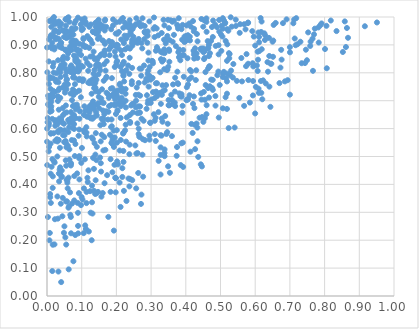
| Category | Series 0 |
|---|---|
| 0.09332710742494632 | 0.635 |
| 0.08445246162562603 | 0.884 |
| 0.07001065503858117 | 0.827 |
| 0.6175253635349519 | 0.728 |
| 0.2744635906738888 | 0.888 |
| 0.061878417320481716 | 0.927 |
| 0.5136913905522834 | 0.98 |
| 0.11229336429314907 | 0.894 |
| 0.21602554632952942 | 0.864 |
| 0.4311145293390619 | 0.87 |
| 0.16754405911338444 | 0.991 |
| 0.3433235673087809 | 0.756 |
| 0.07033823107351322 | 0.897 |
| 0.19841753488332126 | 0.422 |
| 0.3276426470451601 | 0.506 |
| 0.7664976223954308 | 0.807 |
| 0.39625087854839414 | 0.91 |
| 0.04155995003741242 | 0.594 |
| 0.07890753765123992 | 0.977 |
| 0.12596352039203473 | 0.917 |
| 0.4964711650466057 | 0.948 |
| 0.4855994701979328 | 0.682 |
| 0.22039779512864766 | 0.789 |
| 0.35327517767631733 | 0.917 |
| 0.27705013705300396 | 0.428 |
| 0.06475947491705092 | 0.489 |
| 0.4942906293879895 | 0.899 |
| 0.4666430380774208 | 0.9 |
| 0.004846066885495159 | 0.518 |
| 0.10168989879299051 | 0.776 |
| 0.28118632028872204 | 0.947 |
| 0.18745959743924945 | 0.91 |
| 0.11001641885964175 | 0.892 |
| 0.40000335743049165 | 0.914 |
| 0.8053465265295358 | 0.968 |
| 0.08268522239571108 | 0.986 |
| 0.05066881257949596 | 0.758 |
| 0.2958596130232868 | 0.821 |
| 0.264169184591568 | 0.763 |
| 0.16630125288114517 | 0.952 |
| 0.01908088426361776 | 0.973 |
| 0.4593293309129458 | 0.982 |
| 0.05322837337756159 | 0.814 |
| 0.35216622674176457 | 0.878 |
| 0.6071208070080384 | 0.876 |
| 0.2456572896289445 | 0.415 |
| 0.26573200326790547 | 0.657 |
| 0.39141594621713616 | 0.55 |
| 0.08928936337730742 | 0.998 |
| 0.24599749893954848 | 0.897 |
| 0.23038132674363954 | 0.929 |
| 0.5280387680229458 | 0.791 |
| 0.16349903066257399 | 0.616 |
| 0.04958725665321273 | 0.552 |
| 0.0906008137902683 | 0.841 |
| 0.058665780813514146 | 0.948 |
| 0.2667766734859971 | 0.571 |
| 0.21619199094090402 | 0.805 |
| 0.2201868654534751 | 0.792 |
| 0.46898604125320953 | 0.822 |
| 0.6228110973298812 | 0.773 |
| 0.24251388401160068 | 0.958 |
| 0.646489513069468 | 0.832 |
| 0.20215746823162783 | 0.483 |
| 0.25591988275008015 | 0.721 |
| 0.19957029502681156 | 0.713 |
| 0.3812703520432381 | 0.726 |
| 0.21317789538150267 | 0.681 |
| 0.31621910735336844 | 0.728 |
| 0.8643451407871104 | 0.961 |
| 0.14337560606574395 | 0.685 |
| 0.01113406494337299 | 0.782 |
| 0.21985365618289754 | 0.961 |
| 0.6184346737530718 | 0.984 |
| 0.22359208503867978 | 0.933 |
| 0.312879678731237 | 0.639 |
| 0.18844648614245108 | 0.443 |
| 0.3392166535859019 | 0.738 |
| 0.16821976768291746 | 0.524 |
| 0.24463389227182275 | 0.908 |
| 0.7830595978854772 | 0.908 |
| 0.05536913540709898 | 0.467 |
| 0.4023186252905987 | 0.97 |
| 0.32175715372743285 | 0.484 |
| 0.13593288709277007 | 0.745 |
| 0.5098297426781042 | 0.988 |
| 0.09178418392804732 | 0.828 |
| 0.1953236289787702 | 0.821 |
| 0.30271041620228245 | 0.843 |
| 0.07454220480122842 | 0.681 |
| 0.20054662481336893 | 0.723 |
| 0.6109428215271936 | 0.928 |
| 0.15783913526252114 | 0.578 |
| 0.4594565427972541 | 0.995 |
| 0.06253065912574474 | 0.096 |
| 0.36005964984153405 | 0.573 |
| 0.003281615494549195 | 0.718 |
| 0.01097020839997731 | 0.582 |
| 0.19046866440673127 | 0.991 |
| 0.651390417432133 | 0.857 |
| 0.4253634393287855 | 0.614 |
| 0.4222748516593592 | 0.879 |
| 0.07872089254696313 | 0.43 |
| 0.6935785593855301 | 0.773 |
| 0.1585916894620102 | 0.741 |
| 0.38025066018264264 | 0.856 |
| 0.6106923915943925 | 0.728 |
| 0.3486004078403644 | 0.99 |
| 0.8581592307479587 | 0.984 |
| 0.2725581462711324 | 0.635 |
| 0.4207794218268186 | 0.689 |
| 0.14597139255213043 | 0.954 |
| 0.23966946698583524 | 0.62 |
| 0.0566540468076171 | 0.658 |
| 0.11638407443537113 | 0.424 |
| 0.33796336739709554 | 0.884 |
| 0.40075615961090194 | 0.932 |
| 0.09139228247904929 | 0.774 |
| 0.005998731451986483 | 0.92 |
| 0.2605015388213099 | 0.618 |
| 0.08717087606148055 | 0.836 |
| 0.18842786301452996 | 0.745 |
| 0.018727076246454977 | 0.835 |
| 0.4776199384597343 | 0.775 |
| 0.16442855009449853 | 0.867 |
| 0.1233873500221011 | 0.77 |
| 0.27218812383937463 | 0.907 |
| 0.19625404301459715 | 0.897 |
| 0.298887643289107 | 0.692 |
| 0.24529104173198069 | 0.818 |
| 0.7435082480763096 | 0.835 |
| 0.2070733014234135 | 0.946 |
| 0.13880443767661266 | 0.978 |
| 0.13293540101599677 | 0.698 |
| 0.07402278244869576 | 0.602 |
| 0.8526028761861107 | 0.875 |
| 0.4142389530679762 | 0.966 |
| 0.13685206612459078 | 0.81 |
| 0.08168515643849006 | 0.842 |
| 0.22516878922713846 | 0.593 |
| 0.040858666964380896 | 0.05 |
| 0.4237770416445613 | 0.958 |
| 0.6263433940962674 | 0.941 |
| 0.6163695303992871 | 0.771 |
| 0.08328091790722525 | 0.678 |
| 0.07429241103262896 | 0.619 |
| 0.2929290122923942 | 0.75 |
| 0.32842864378299375 | 0.849 |
| 0.3468407766614354 | 0.811 |
| 0.24583307692582623 | 0.688 |
| 0.2549711585187677 | 0.915 |
| 0.2491362299563452 | 0.929 |
| 0.15199192651175242 | 0.822 |
| 0.06757050388877639 | 0.821 |
| 0.05867051996637451 | 0.406 |
| 0.016741287649905012 | 0.429 |
| 0.0595891594296325 | 0.386 |
| 0.17881244385727146 | 0.68 |
| 0.07473345050846947 | 0.8 |
| 0.5565695375040615 | 0.974 |
| 0.22640089580502487 | 0.725 |
| 0.18473958888255082 | 0.896 |
| 0.3253594485430067 | 0.728 |
| 0.223386873137695 | 0.804 |
| 0.6408460916314357 | 0.75 |
| 0.3469642374666171 | 0.932 |
| 0.43204057757435277 | 0.939 |
| 0.1661523724823416 | 0.88 |
| 0.14905683001691739 | 0.731 |
| 0.005708498747101554 | 0.619 |
| 0.2564439577390568 | 0.676 |
| 0.08027008772111877 | 0.502 |
| 0.15370820202005875 | 0.612 |
| 0.10786133806920872 | 0.68 |
| 0.8343741909260847 | 0.95 |
| 0.010706641149494933 | 0.929 |
| 0.15785557753152613 | 0.694 |
| 0.34217571351007203 | 0.915 |
| 0.3736821800458787 | 0.502 |
| 0.19191194376988785 | 0.593 |
| 0.2413830644314252 | 0.939 |
| 0.15684702480620027 | 0.356 |
| 0.034038102988602104 | 0.624 |
| 0.14901498868893603 | 0.83 |
| 0.6049122909608293 | 0.826 |
| 0.07455216035506895 | 0.74 |
| 0.06748433175463864 | 0.726 |
| 0.021485956361151692 | 0.185 |
| 0.033056157756863214 | 0.587 |
| 0.0204756372250543 | 0.947 |
| 0.20181166482287494 | 0.55 |
| 0.01640408438656893 | 0.387 |
| 0.04084063218853917 | 0.976 |
| 0.3042419487356556 | 0.782 |
| 0.5802495257485826 | 0.774 |
| 0.35041093210573937 | 0.703 |
| 0.0071857451910184444 | 0.785 |
| 0.3686024769470495 | 0.733 |
| 0.4600086188989244 | 0.947 |
| 0.09010469843676883 | 0.822 |
| 0.03252993259102299 | 0.627 |
| 0.008685841869015332 | 0.66 |
| 0.05516663706453839 | 0.339 |
| 0.2204348199870224 | 0.585 |
| 0.2151539344671225 | 0.71 |
| 0.015272525534928527 | 0.635 |
| 0.13521579251085947 | 0.641 |
| 0.27957973412668 | 0.826 |
| 0.3389631065390514 | 0.87 |
| 0.0303671699634529 | 0.554 |
| 0.0601939761115966 | 0.539 |
| 0.080157718434822 | 0.782 |
| 0.5407668959036714 | 0.604 |
| 0.39260040006501873 | 0.882 |
| 0.17325945002766663 | 0.433 |
| 0.44405748498341235 | 0.726 |
| 0.38484266647942733 | 0.716 |
| 0.17877283288876789 | 0.884 |
| 0.10496824063477295 | 0.924 |
| 0.3102690774477035 | 0.71 |
| 0.0645887933968502 | 0.621 |
| 0.33579453681614935 | 0.846 |
| 0.22662538269006738 | 0.7 |
| 0.06714236044585487 | 0.291 |
| 0.5370390514409771 | 0.831 |
| 0.08412383113221322 | 0.853 |
| 0.5185994377121194 | 0.67 |
| 0.1059221362961964 | 0.225 |
| 0.4502607122449295 | 0.965 |
| 0.46670432510944615 | 0.86 |
| 0.06937170365005974 | 0.225 |
| 0.02210918003961837 | 0.891 |
| 0.01958036646278216 | 0.484 |
| 0.20212642794837576 | 0.842 |
| 0.06522065853411463 | 0.88 |
| 0.9508638520165739 | 0.98 |
| 0.14376144089441423 | 0.852 |
| 0.015913669154299703 | 0.993 |
| 0.5471191457439915 | 0.771 |
| 0.4447688870937738 | 0.882 |
| 0.2570824320430596 | 0.386 |
| 0.32614903458643074 | 0.802 |
| 0.03207946437220843 | 0.56 |
| 0.13733505801615176 | 0.849 |
| 0.14507108774325783 | 0.98 |
| 0.05125651411912846 | 0.742 |
| 0.06451908244811588 | 0.525 |
| 0.8063100787336912 | 0.816 |
| 0.13944898329144106 | 0.507 |
| 0.10638855669343172 | 0.594 |
| 0.24681600490542566 | 0.957 |
| 0.29231033325554157 | 0.872 |
| 0.40605239575343877 | 0.935 |
| 0.06662478312360698 | 0.932 |
| 0.02209176997923712 | 0.478 |
| 0.029993898051308476 | 0.357 |
| 0.33046985764820536 | 0.943 |
| 0.1831833292838505 | 0.373 |
| 0.4897915927236649 | 0.964 |
| 0.1026257526749228 | 0.77 |
| 0.24440424686058648 | 0.76 |
| 0.2914771635031145 | 0.808 |
| 0.2586239964306333 | 0.747 |
| 0.15339955222973234 | 0.809 |
| 0.41072050829761275 | 0.72 |
| 0.375730141732597 | 0.804 |
| 0.286053557459495 | 0.779 |
| 0.3996406478571656 | 0.918 |
| 0.12419061967398559 | 0.376 |
| 0.034848394874342103 | 0.411 |
| 0.2282354608853071 | 0.966 |
| 0.08260756440638772 | 0.959 |
| 0.2545404442229069 | 0.54 |
| 0.0464511781741489 | 0.952 |
| 0.04111366882620704 | 0.826 |
| 0.19285724943928217 | 0.534 |
| 0.051225878829543436 | 0.655 |
| 0.19800438810327947 | 0.941 |
| 0.10843313025501211 | 0.995 |
| 0.15302408777650434 | 0.496 |
| 0.23822367676987555 | 0.989 |
| 0.01655895290951226 | 0.184 |
| 0.2557938662863637 | 0.974 |
| 0.00908444176340606 | 0.354 |
| 0.09977094511131324 | 0.355 |
| 0.3942071356941327 | 0.786 |
| 0.02122539533457546 | 0.986 |
| 0.14370728586029902 | 0.647 |
| 0.13220178212665434 | 0.948 |
| 0.23244948049871028 | 0.891 |
| 0.019139129109571718 | 0.801 |
| 0.5680885386967607 | 0.974 |
| 0.12992617035090026 | 0.678 |
| 0.09894442398774705 | 0.825 |
| 0.01820347453498028 | 0.78 |
| 0.6188418753118041 | 0.884 |
| 0.024703411323214186 | 0.63 |
| 0.36597066813757295 | 0.987 |
| 0.6405757428511759 | 0.86 |
| 0.6171141159988063 | 0.946 |
| 0.1344769958272003 | 0.876 |
| 0.21487330044220676 | 0.745 |
| 0.4526100434418463 | 0.849 |
| 0.2814711260001591 | 0.968 |
| 0.14694455472670487 | 0.945 |
| 0.03283081190493653 | 0.766 |
| 0.5790578845040826 | 0.978 |
| 0.012759501209366642 | 0.895 |
| 0.6500039046627353 | 0.912 |
| 0.05159515418394256 | 0.729 |
| 0.15053854131981526 | 0.673 |
| 0.3479326615367675 | 0.617 |
| 0.267905927099664 | 0.657 |
| 0.43577658387864504 | 0.498 |
| 0.42394284414178374 | 0.877 |
| 0.5795340222899762 | 0.98 |
| 0.8178368419635587 | 0.987 |
| 0.12874246693615143 | 0.2 |
| 0.21201855289776195 | 0.319 |
| 0.28914740431649444 | 0.908 |
| 0.005081079901098184 | 0.61 |
| 0.40185611518271047 | 0.702 |
| 0.1554028520334675 | 0.968 |
| 0.18881669086162423 | 0.568 |
| 0.4003346729249193 | 0.922 |
| 0.19529991616308195 | 0.734 |
| 0.4432980849404792 | 0.472 |
| 0.07224972377674188 | 0.331 |
| 0.22042749499804415 | 0.48 |
| 0.7491882543967722 | 0.845 |
| 0.5443813914313284 | 0.968 |
| 0.14517408187782888 | 0.832 |
| 0.11392422904308819 | 0.373 |
| 0.6353868749911382 | 0.838 |
| 0.40554845447960697 | 0.704 |
| 0.17166584631758752 | 0.729 |
| 0.16884786065102408 | 0.808 |
| 0.013265056492702598 | 0.463 |
| 0.044275626423304404 | 0.286 |
| 0.10647365320955893 | 0.386 |
| 0.09884495538878879 | 0.477 |
| 0.07084924279744975 | 0.634 |
| 0.13526777115485966 | 0.456 |
| 0.03428342965822673 | 0.921 |
| 0.10928776582457922 | 0.587 |
| 0.05400804894681388 | 0.486 |
| 0.17109967234300394 | 0.965 |
| 0.23906176386118727 | 0.887 |
| 0.45100150572274955 | 0.874 |
| 0.2134497070621566 | 0.88 |
| 0.31346322192172127 | 0.556 |
| 0.16173524046359022 | 0.967 |
| 0.23823230772229664 | 0.542 |
| 0.13055089083321314 | 0.906 |
| 0.6368010547889358 | 0.804 |
| 0.045136171473953435 | 0.85 |
| 0.49462712898370764 | 0.866 |
| 0.0753838215751389 | 0.797 |
| 0.21715410217986542 | 0.458 |
| 0.21929493929766442 | 0.582 |
| 0.3876781147068705 | 0.956 |
| 0.6280504482905608 | 0.918 |
| 0.08714131700045358 | 0.883 |
| 0.6071911472535048 | 0.807 |
| 0.14067641800198227 | 0.584 |
| 0.3275057871336694 | 0.576 |
| 0.149262795889065 | 0.714 |
| 0.16550141423526177 | 0.863 |
| 0.045822207332507414 | 0.951 |
| 0.29158779768503706 | 0.7 |
| 0.23957730519071752 | 0.419 |
| 0.11740715437017546 | 0.643 |
| 0.29006221865924275 | 0.796 |
| 0.1721647613138042 | 0.842 |
| 0.20921505821291198 | 0.407 |
| 0.5097657808779557 | 0.803 |
| 0.6018458667347588 | 0.749 |
| 0.1449252543888515 | 0.848 |
| 0.037909687856379604 | 0.461 |
| 0.3750612652841656 | 0.972 |
| 0.011457533454408808 | 0.935 |
| 0.3942211809178866 | 0.863 |
| 0.26392531463863045 | 0.721 |
| 0.4649939088216555 | 0.889 |
| 0.5263336709797022 | 0.867 |
| 0.0017388114422324241 | 0.623 |
| 0.2721731295461255 | 0.363 |
| 0.21212160163331417 | 0.821 |
| 0.332683979185301 | 0.755 |
| 0.0356612653027748 | 0.744 |
| 0.40634409999288545 | 0.707 |
| 0.11936430844456924 | 0.45 |
| 0.10083859630262593 | 0.991 |
| 0.3005241751384484 | 0.704 |
| 0.10498044779319138 | 0.776 |
| 0.02678150267977808 | 0.925 |
| 0.3693426745666788 | 0.782 |
| 0.33578157276947906 | 0.99 |
| 0.15330219290113467 | 0.958 |
| 0.19587367317365956 | 0.683 |
| 0.014602071854006526 | 0.723 |
| 0.23741473012516934 | 0.393 |
| 0.05552419606507131 | 0.925 |
| 0.250258443605627 | 0.909 |
| 0.018032527978964263 | 0.735 |
| 0.17863281712795476 | 0.914 |
| 0.35308722549145355 | 0.684 |
| 0.31869918762867433 | 0.885 |
| 0.04640427389998536 | 0.576 |
| 0.14841306910884666 | 0.795 |
| 0.2503328063462743 | 0.967 |
| 0.05377282669283878 | 0.991 |
| 0.10049701842690884 | 0.962 |
| 0.3105126659698221 | 0.628 |
| 0.08191212785978508 | 0.545 |
| 0.529392597184269 | 0.999 |
| 0.15066845651588212 | 0.929 |
| 0.12315425340785469 | 0.763 |
| 0.4266507801032685 | 0.888 |
| 0.4160480270557385 | 0.617 |
| 0.07777544541502068 | 0.558 |
| 0.368153269749644 | 0.693 |
| 0.2279793930752365 | 0.553 |
| 0.08512533374722231 | 0.882 |
| 0.4909157907120407 | 0.791 |
| 0.11415695942242132 | 0.643 |
| 0.2858882725830224 | 0.947 |
| 0.05223076412489125 | 0.882 |
| 0.03813965401129793 | 0.71 |
| 0.21086532907816047 | 0.701 |
| 0.17571495296144346 | 0.632 |
| 0.6855558755804928 | 0.769 |
| 0.37772644051302395 | 0.958 |
| 0.23895948007820456 | 0.649 |
| 0.3909568256322439 | 0.972 |
| 0.12573144839185835 | 0.299 |
| 0.10346677462936327 | 0.822 |
| 0.4050635956855102 | 0.852 |
| 0.1967040279093828 | 0.424 |
| 0.026163016534713757 | 0.768 |
| 0.04885639231988381 | 0.617 |
| 0.0690815403738495 | 0.948 |
| 0.4546980263138608 | 0.854 |
| 0.0909789595050775 | 0.574 |
| 0.02281219337127982 | 0.275 |
| 0.16245260833896624 | 0.522 |
| 0.4158517561790839 | 0.783 |
| 0.20027721319084657 | 0.837 |
| 0.035316203125515755 | 0.9 |
| 0.05543576395369576 | 0.547 |
| 0.0010576126301251598 | 0.802 |
| 0.047570400631467114 | 0.858 |
| 0.006872851774574529 | 0.778 |
| 0.165139992445275 | 0.652 |
| 0.5846288556027115 | 0.693 |
| 0.08948385520441304 | 0.251 |
| 0.2568031175442783 | 0.7 |
| 0.05596177997711471 | 0.533 |
| 0.13119636094905007 | 0.635 |
| 0.04916156078890355 | 0.928 |
| 0.012357681979431101 | 0.68 |
| 0.5304843490038923 | 0.808 |
| 0.4232955882723064 | 0.865 |
| 0.3582227986376607 | 0.721 |
| 0.05365384213646518 | 0.951 |
| 0.43971082774412407 | 0.639 |
| 0.2899664962417682 | 0.933 |
| 0.24069647465100208 | 0.947 |
| 0.13627355603223357 | 0.669 |
| 0.16320684056161194 | 0.692 |
| 0.02550317891397824 | 0.976 |
| 0.2170274658994501 | 0.427 |
| 0.21577210011753445 | 0.733 |
| 0.33887090166919864 | 0.501 |
| 0.037784836282205636 | 0.597 |
| 0.09760122461958642 | 0.712 |
| 0.1944878145909379 | 0.47 |
| 0.11452375349579624 | 0.572 |
| 0.07402527514722557 | 0.917 |
| 0.09044608545921784 | 0.811 |
| 0.1522988002005693 | 0.86 |
| 0.4088128823010506 | 0.776 |
| 0.1354466977451717 | 0.682 |
| 0.11154063474820997 | 0.851 |
| 0.023686239966609568 | 0.61 |
| 0.19750302471138248 | 0.858 |
| 0.32723256880415974 | 0.876 |
| 0.518730928278715 | 0.725 |
| 0.03725994636993102 | 0.438 |
| 0.21752463520014265 | 0.83 |
| 0.03808871123692992 | 0.818 |
| 0.08297196715984234 | 0.915 |
| 0.25742569283964667 | 0.51 |
| 0.03359854663744244 | 0.948 |
| 0.012426270863230338 | 0.965 |
| 0.002620480737549058 | 0.283 |
| 0.09503189328068085 | 0.662 |
| 0.4029513531133868 | 0.748 |
| 0.4937934149127994 | 0.804 |
| 0.22163219877716034 | 0.377 |
| 0.38118821075536957 | 0.884 |
| 0.07135231928502594 | 0.559 |
| 0.35139584080179653 | 0.884 |
| 0.08684255004260466 | 0.439 |
| 0.017140030205711088 | 0.822 |
| 0.18399043155415562 | 0.743 |
| 0.06380489989959959 | 0.322 |
| 0.013083677854927589 | 0.663 |
| 0.14292264540834354 | 0.982 |
| 0.09280189478997958 | 0.597 |
| 0.19024004044985432 | 0.97 |
| 0.16344293809144794 | 0.771 |
| 0.06421591713113517 | 0.983 |
| 0.23003797215237753 | 0.64 |
| 0.23371427676611845 | 0.826 |
| 0.05289595413374171 | 0.21 |
| 0.08235555256686755 | 0.638 |
| 0.7121480640214822 | 0.991 |
| 0.2038302832964557 | 0.899 |
| 0.1669001464504679 | 0.987 |
| 0.7002113637719625 | 0.873 |
| 0.20336007925850164 | 0.666 |
| 0.12488159631287665 | 0.858 |
| 0.5601127460885287 | 0.853 |
| 0.3386204107283707 | 0.512 |
| 0.10350389085980105 | 0.957 |
| 0.15661525276790855 | 0.708 |
| 0.015204292338279135 | 0.089 |
| 0.7653105471331986 | 0.922 |
| 0.3923749983564334 | 0.463 |
| 0.008956841283550121 | 0.365 |
| 0.04089126541848842 | 0.908 |
| 0.11377038513802218 | 0.586 |
| 0.6520381472732322 | 0.916 |
| 0.03734042217390454 | 0.531 |
| 0.5945207410657075 | 0.823 |
| 0.2824937651907615 | 0.558 |
| 0.593414098165515 | 0.719 |
| 0.11883936415518725 | 0.666 |
| 0.3172276012376103 | 0.716 |
| 0.015567957025387158 | 0.49 |
| 0.20474338996725328 | 0.737 |
| 0.0846959940701778 | 0.908 |
| 0.12223545165600902 | 0.658 |
| 0.7596731119772844 | 0.912 |
| 0.5542039468226748 | 0.71 |
| 0.09731052409339525 | 0.973 |
| 0.6115411809243902 | 0.878 |
| 0.18558718788989015 | 0.549 |
| 0.8674634189980486 | 0.925 |
| 0.01255501597867792 | 0.708 |
| 0.22786877356171054 | 0.922 |
| 0.0002486938166764707 | 0.891 |
| 0.018741990207220116 | 0.583 |
| 0.15625742928109854 | 0.866 |
| 0.19549473457358435 | 0.876 |
| 0.012497471730546161 | 0.696 |
| 0.45250880161428575 | 0.989 |
| 0.6438292795428854 | 0.678 |
| 0.38371309348260263 | 0.861 |
| 0.7340085040175094 | 0.834 |
| 0.014008212015966026 | 0.888 |
| 0.010288080964908963 | 0.742 |
| 0.05463099130902305 | 0.943 |
| 0.061860615204340275 | 0.317 |
| 0.24746754484318978 | 0.658 |
| 0.27539523276941547 | 0.971 |
| 0.0004996344169901912 | 0.6 |
| 0.061811411312290176 | 0.873 |
| 0.44643125568705144 | 0.464 |
| 0.010650889443437617 | 0.438 |
| 0.44252344656635867 | 0.886 |
| 0.07515223853869424 | 0.783 |
| 0.04367732003278946 | 0.826 |
| 0.20098260635222243 | 0.901 |
| 0.5358155317522965 | 0.783 |
| 0.19803218737591255 | 0.372 |
| 0.12975108758065979 | 0.396 |
| 0.16208063022587516 | 0.914 |
| 0.18997243608362646 | 0.543 |
| 0.005488952961306026 | 0.76 |
| 0.02906766618584511 | 0.615 |
| 0.20947731290156646 | 0.693 |
| 0.26439351153519375 | 0.921 |
| 0.13907867697231024 | 0.748 |
| 0.05452478026891028 | 0.969 |
| 0.4120860367421524 | 0.916 |
| 0.2216261201758395 | 0.907 |
| 0.699960653566993 | 0.722 |
| 0.3136800288962013 | 0.762 |
| 0.057672711633036666 | 0.339 |
| 0.046143304915287064 | 0.747 |
| 0.3327159555829057 | 0.625 |
| 0.20933174461761894 | 0.757 |
| 0.3108632843872676 | 0.58 |
| 0.18705285637486113 | 0.781 |
| 0.05086174237216945 | 0.594 |
| 0.32819057376684857 | 0.689 |
| 0.2684972432122863 | 0.718 |
| 0.4333484408460546 | 0.604 |
| 0.07887641786058175 | 0.898 |
| 0.43371447820001174 | 0.555 |
| 0.44528538533915696 | 0.704 |
| 0.33103729004682936 | 0.721 |
| 0.024403929565210536 | 0.625 |
| 0.07201298492267194 | 0.702 |
| 0.05362020468275619 | 0.555 |
| 0.8012004580152037 | 0.885 |
| 0.18483606788494333 | 0.606 |
| 0.006962183487536855 | 0.2 |
| 0.5066842510609805 | 0.996 |
| 0.7525970636800398 | 0.945 |
| 0.3055233077252437 | 0.731 |
| 0.5680923119813054 | 0.681 |
| 0.24952859948176742 | 0.689 |
| 0.2372019785369519 | 0.796 |
| 0.04177491497255792 | 0.427 |
| 0.05536044265934714 | 0.184 |
| 0.27533171406508705 | 0.995 |
| 0.25748020510217917 | 0.995 |
| 0.41977740546492204 | 0.584 |
| 0.6748871234804585 | 0.882 |
| 0.008081766057076889 | 0.226 |
| 0.20433565630409023 | 0.472 |
| 0.45660728351457125 | 0.803 |
| 0.13282111001037933 | 0.946 |
| 0.46420630187742795 | 0.745 |
| 0.19163294116825091 | 0.564 |
| 0.0033501786690449675 | 0.688 |
| 0.09186323718483713 | 0.369 |
| 0.15473934655532318 | 0.554 |
| 0.4572200343613122 | 0.756 |
| 0.14084682477521704 | 0.94 |
| 0.07765873436403559 | 0.649 |
| 0.09121451064035957 | 0.868 |
| 0.053150940219434006 | 0.79 |
| 0.5187450286836113 | 0.843 |
| 0.4600467534901821 | 0.684 |
| 0.40651249692865754 | 0.758 |
| 0.5938412500481016 | 0.771 |
| 0.523540830462565 | 0.602 |
| 0.14286724918250016 | 0.822 |
| 0.7303778947219662 | 0.911 |
| 0.5252110361006866 | 0.852 |
| 0.14169525007969075 | 0.658 |
| 0.09298847144395861 | 0.501 |
| 0.0901750240406225 | 0.804 |
| 0.210133103768114 | 0.761 |
| 0.03718533041300631 | 0.966 |
| 0.0860898565305993 | 0.686 |
| 0.26426558162133484 | 0.6 |
| 0.0701383873902437 | 0.91 |
| 0.07598993442076452 | 0.816 |
| 0.042774649310710955 | 0.889 |
| 0.5195735409714478 | 0.902 |
| 0.34063186469765205 | 0.645 |
| 0.19413430211357352 | 0.687 |
| 0.16584162889315768 | 0.404 |
| 0.2029944590063707 | 0.662 |
| 0.11044204610510899 | 0.664 |
| 0.056656516336890284 | 0.804 |
| 0.30529436065474946 | 0.834 |
| 0.18671522043180133 | 0.608 |
| 0.040089414342513896 | 0.625 |
| 0.039784600923693625 | 0.331 |
| 0.31008642502725325 | 0.928 |
| 0.24610127593200815 | 0.903 |
| 0.14177790008278146 | 0.965 |
| 0.47258855234531927 | 0.914 |
| 0.49593578692358486 | 0.989 |
| 0.010550378562793505 | 0.986 |
| 0.4288703791130908 | 0.774 |
| 0.03044700340309836 | 0.59 |
| 0.0927360722843874 | 0.493 |
| 0.030857812860972333 | 0.715 |
| 0.3779483357859119 | 0.76 |
| 0.1805031088887219 | 0.863 |
| 0.03421300624281265 | 0.984 |
| 0.025848040526107896 | 0.92 |
| 0.9160231593435163 | 0.967 |
| 0.2975135120847676 | 0.621 |
| 0.03403903393210539 | 0.668 |
| 0.09799341157916142 | 0.326 |
| 0.00742604885392828 | 0.986 |
| 0.5066791771637564 | 0.785 |
| 0.06129048398018533 | 0.588 |
| 0.2139489631219036 | 0.919 |
| 0.045659585932323665 | 0.62 |
| 0.039390920157224785 | 0.814 |
| 0.05825395422726232 | 0.996 |
| 0.15503997563906546 | 0.476 |
| 0.5162780241497349 | 0.78 |
| 0.13401303198173198 | 0.797 |
| 0.06220804741878683 | 0.424 |
| 0.4978162958141088 | 0.756 |
| 0.07824657321439621 | 0.635 |
| 0.040187896180269744 | 0.905 |
| 0.03604322578571029 | 0.637 |
| 0.10522856166674388 | 0.92 |
| 0.020062799779203888 | 1 |
| 0.19588537505318793 | 0.713 |
| 0.14002219962006868 | 0.743 |
| 0.5959127058526833 | 0.93 |
| 0.4630832059218024 | 0.914 |
| 0.74610132173737 | 0.883 |
| 0.056116978232255144 | 0.773 |
| 0.271468148529615 | 0.79 |
| 0.05875093510845786 | 0.852 |
| 0.1668917402002783 | 0.904 |
| 0.5439404055958573 | 0.99 |
| 0.015082744286307181 | 0.908 |
| 0.4335604082262945 | 0.853 |
| 0.028286412365832625 | 0.562 |
| 0.17140608420689385 | 0.786 |
| 0.2187620220719242 | 0.832 |
| 0.08106166496340583 | 0.805 |
| 0.47788825411575053 | 0.928 |
| 0.265571798868785 | 0.981 |
| 0.5998632314874315 | 0.654 |
| 0.34208839876208663 | 0.906 |
| 0.2880298887719308 | 0.72 |
| 0.11742208874851645 | 0.409 |
| 0.06759872639701803 | 0.803 |
| 0.2901127466374849 | 0.948 |
| 0.7182221220252807 | 0.996 |
| 0.4626150317252452 | 0.887 |
| 0.12614118114424644 | 0.973 |
| 0.3463479347366638 | 0.587 |
| 0.3333348658580698 | 0.734 |
| 0.5024034240403104 | 0.879 |
| 0.04185740379545777 | 0.827 |
| 0.5066724004675855 | 0.673 |
| 0.29631386209797717 | 0.788 |
| 0.22534877607126158 | 0.884 |
| 0.19824290725262617 | 0.422 |
| 0.23827763613056385 | 0.854 |
| 0.2357547166980981 | 0.961 |
| 0.3373944826962674 | 0.919 |
| 0.3899610450762362 | 0.657 |
| 0.27633302786027125 | 0.562 |
| 0.35655977536241756 | 0.988 |
| 0.4233682546850699 | 0.715 |
| 0.056241764648346515 | 0.418 |
| 0.17674709476562867 | 0.284 |
| 0.7222267624205686 | 0.903 |
| 0.018466084751469602 | 0.931 |
| 0.5925861499155723 | 0.834 |
| 0.33006586949108807 | 0.575 |
| 0.04878451732892852 | 0.227 |
| 0.38556805368169744 | 0.469 |
| 0.363197449961012 | 0.758 |
| 0.49503691420720564 | 0.64 |
| 0.12969345338245686 | 0.336 |
| 0.07128873536164892 | 0.959 |
| 0.04070397947861926 | 0.634 |
| 0.3842230364588991 | 0.845 |
| 0.18479667285596146 | 0.684 |
| 0.5915967620728743 | 0.949 |
| 0.16258576194396102 | 0.637 |
| 0.131146225754443 | 0.296 |
| 0.5072353484670106 | 0.797 |
| 0.5323421200057737 | 0.965 |
| 0.447042972917825 | 0.642 |
| 0.5056013840860444 | 0.93 |
| 0.06842418918616777 | 0.473 |
| 0.017923927804721962 | 0.715 |
| 0.18661203950176242 | 0.902 |
| 0.008561758041605194 | 0.926 |
| 0.16473501152576742 | 0.831 |
| 0.14107264433497868 | 0.733 |
| 0.26074839863450516 | 0.907 |
| 0.11573750011966955 | 0.836 |
| 0.41151241552313567 | 0.93 |
| 0.23951630091520515 | 0.624 |
| 0.6204403479522804 | 0.705 |
| 0.28078475633378386 | 0.921 |
| 0.13165832277747613 | 0.691 |
| 0.28703104349117337 | 0.671 |
| 0.1558192178829041 | 0.446 |
| 0.07073553519568132 | 0.882 |
| 0.12177203334286779 | 0.922 |
| 0.1259654679452088 | 0.684 |
| 0.22868944865905938 | 0.81 |
| 0.6000221797138257 | 0.897 |
| 0.005982940283025706 | 0.534 |
| 0.268260148412244 | 0.679 |
| 0.004981459529068366 | 0.709 |
| 0.07811186109440327 | 0.684 |
| 0.4843434206482502 | 0.972 |
| 0.13547712804495848 | 0.377 |
| 0.24237769381235352 | 0.683 |
| 0.41339647201674634 | 0.517 |
| 0.07649354827278443 | 0.721 |
| 0.1572944889975061 | 0.635 |
| 0.29757888977719926 | 0.62 |
| 0.08793675848289517 | 0.334 |
| 0.13113621334336256 | 0.777 |
| 0.01092346277229217 | 0.673 |
| 0.4852987362811818 | 0.717 |
| 0.06055831154003799 | 0.869 |
| 0.04541654187371513 | 0.845 |
| 0.48623135062437395 | 0.896 |
| 0.2612570175464287 | 0.512 |
| 0.5735927589291145 | 0.824 |
| 0.06023931751101341 | 0.759 |
| 0.14220233120429282 | 0.487 |
| 0.29577716372556606 | 0.56 |
| 0.10492400589998296 | 0.896 |
| 0.14295217860444043 | 0.368 |
| 0.6285102437123503 | 0.935 |
| 0.47876413378179417 | 0.987 |
| 0.14247714504554465 | 0.775 |
| 0.1617536423792767 | 0.629 |
| 0.3490066928565023 | 0.465 |
| 0.13699207497558508 | 0.548 |
| 0.78746265823905 | 0.97 |
| 0.2290150452345101 | 0.341 |
| 0.20219151306034722 | 0.715 |
| 0.43389792490723866 | 0.913 |
| 0.29030754657830804 | 0.69 |
| 0.70990850340288 | 0.977 |
| 0.7718388625119323 | 0.958 |
| 0.6156086147989185 | 0.996 |
| 0.37962142890132233 | 0.996 |
| 0.5146764789820759 | 0.713 |
| 0.09222012736663576 | 0.736 |
| 0.13209669322895534 | 0.563 |
| 0.4122921900576402 | 0.81 |
| 0.0211637541772004 | 0.884 |
| 0.17648804428150588 | 0.722 |
| 0.1340877051343501 | 0.681 |
| 0.19967661603697784 | 0.981 |
| 0.38769696940605003 | 0.723 |
| 0.0427431340598059 | 0.428 |
| 0.611332162636472 | 0.909 |
| 0.22005420951253418 | 0.52 |
| 0.09418463064504501 | 0.881 |
| 0.06912272072540171 | 0.476 |
| 0.13357358030948696 | 0.947 |
| 0.01048042340170352 | 0.546 |
| 0.06897292613274675 | 0.659 |
| 0.3761959019149912 | 0.763 |
| 0.365868105344743 | 0.936 |
| 0.09264377285364211 | 0.81 |
| 0.06526448549245578 | 0.892 |
| 0.2028063247516687 | 0.94 |
| 0.4641518163424666 | 0.815 |
| 0.07594971088610558 | 0.937 |
| 0.23487204710685095 | 0.421 |
| 0.10914232643205912 | 0.49 |
| 0.08848249623363147 | 0.675 |
| 0.7820533684699434 | 0.963 |
| 0.21976836672809041 | 0.692 |
| 0.1648339639867883 | 0.873 |
| 0.3881156955883802 | 0.714 |
| 0.6304059319389534 | 0.762 |
| 0.5196703291476715 | 0.957 |
| 0.0840565195902091 | 0.73 |
| 0.11130426200255816 | 0.982 |
| 0.19165219291612312 | 0.717 |
| 0.1136941974050828 | 0.333 |
| 0.10067112124137001 | 0.531 |
| 0.2875508356186566 | 0.94 |
| 0.09308402969220353 | 0.904 |
| 0.12863379457024215 | 0.725 |
| 0.11876797279915707 | 0.807 |
| 0.11009404384924348 | 0.253 |
| 0.37159649073665457 | 0.895 |
| 0.04557737588242272 | 0.674 |
| 0.6999169275157038 | 0.892 |
| 0.3963448480350813 | 0.93 |
| 0.0779892348087804 | 0.599 |
| 0.07849552521309977 | 0.343 |
| 0.05312170366697411 | 0.883 |
| 0.00029352328618437173 | 0.553 |
| 0.07905941288951746 | 0.734 |
| 0.519550409324154 | 0.797 |
| 0.08919424653513586 | 0.298 |
| 0.5225436426914166 | 0.951 |
| 0.15975138783418297 | 0.916 |
| 0.11881875387818208 | 0.765 |
| 0.1482454053417782 | 0.691 |
| 0.30726294733442894 | 0.958 |
| 0.10815786685436812 | 0.587 |
| 0.11643162720928646 | 0.931 |
| 0.36398306111141565 | 0.688 |
| 0.09338347861803065 | 0.418 |
| 0.6396430079411699 | 0.925 |
| 0.28243397403999426 | 0.943 |
| 0.2633320868300325 | 0.68 |
| 0.10634057561949983 | 0.982 |
| 0.042482362001901364 | 0.45 |
| 0.14885617961962394 | 0.99 |
| 0.24462451585240363 | 0.77 |
| 0.186036329549354 | 0.633 |
| 0.08989586160493113 | 0.224 |
| 0.05859803189602242 | 0.414 |
| 0.3319586944066403 | 0.84 |
| 0.34541921389069097 | 0.81 |
| 0.29011588554056533 | 0.774 |
| 0.0576172455771804 | 0.777 |
| 0.30841422970488586 | 0.998 |
| 0.07795045344337581 | 0.616 |
| 0.034876627885937594 | 0.812 |
| 0.22476392295174785 | 0.979 |
| 0.08268399141570171 | 0.806 |
| 0.08052252769227841 | 0.759 |
| 0.6081266879535607 | 0.847 |
| 0.42403420144254156 | 0.851 |
| 0.12156158053213217 | 0.889 |
| 0.5187206601584562 | 0.769 |
| 0.22654265105405202 | 0.742 |
| 0.29505731751276165 | 0.984 |
| 0.3440863597604603 | 0.581 |
| 0.14358904587867294 | 0.535 |
| 0.30790171808784106 | 0.651 |
| 0.5243414439879522 | 0.87 |
| 0.032998537370257375 | 0.945 |
| 0.11294862165754183 | 0.975 |
| 0.13889655063170658 | 0.366 |
| 0.03646003326935621 | 0.453 |
| 0.42313023954550044 | 0.949 |
| 0.056621000277171096 | 0.759 |
| 0.3604382021652247 | 0.702 |
| 0.3505042771583595 | 0.684 |
| 0.11332044808938513 | 0.605 |
| 0.039839912187716875 | 0.894 |
| 0.27188091472911835 | 0.815 |
| 0.2267937871124649 | 0.614 |
| 0.050583393405147725 | 0.576 |
| 0.1397749184684033 | 0.788 |
| 0.1915048421365071 | 0.722 |
| 0.031543858079283504 | 0.699 |
| 0.33216697467793455 | 0.872 |
| 0.2663749199828582 | 0.571 |
| 0.22127327609014402 | 0.839 |
| 0.20274103343340932 | 0.689 |
| 0.6699642478180072 | 0.763 |
| 0.3161024911709023 | 0.959 |
| 0.39074538680929716 | 0.682 |
| 0.03859917704979465 | 0.801 |
| 0.07604261538816137 | 0.954 |
| 0.7585913339705429 | 0.896 |
| 0.46923590006324845 | 0.752 |
| 0.38710682168030563 | 0.547 |
| 0.3894461955206605 | 0.919 |
| 0.6097038739732709 | 0.743 |
| 0.054412240450179894 | 0.683 |
| 0.37470126526314307 | 0.534 |
| 0.716541475880962 | 0.899 |
| 0.26754610074749285 | 0.97 |
| 0.2091603106739104 | 0.983 |
| 0.010495737215108103 | 0.584 |
| 0.1768659809083607 | 0.66 |
| 0.04181902603632193 | 0.826 |
| 0.03141404149078031 | 0.277 |
| 0.5796636568258768 | 0.832 |
| 0.18333056392938696 | 0.891 |
| 0.47785859440164846 | 0.739 |
| 0.20945875583226548 | 0.522 |
| 0.19866054008175504 | 0.652 |
| 0.2671422935255451 | 0.815 |
| 0.08148742963202049 | 0.849 |
| 0.2986091809238035 | 0.775 |
| 0.12922432023675856 | 0.568 |
| 0.18488145247061383 | 0.956 |
| 0.672773970681529 | 0.819 |
| 0.170116008352185 | 0.662 |
| 0.4759703665985988 | 0.745 |
| 0.14140425738810924 | 0.827 |
| 0.02120832149420282 | 0.982 |
| 0.16055488832701925 | 0.369 |
| 0.22732989419661553 | 0.676 |
| 0.07782032231278968 | 0.862 |
| 0.2629111591674621 | 0.441 |
| 0.14145281943835175 | 0.965 |
| 0.21469016415915332 | 0.992 |
| 0.445020360132553 | 0.993 |
| 0.05615427968507469 | 0.742 |
| 0.2784922819348814 | 0.628 |
| 0.031252985254932586 | 0.715 |
| 0.33834665023093935 | 0.97 |
| 0.12199842932588134 | 0.964 |
| 0.16120525154885545 | 0.665 |
| 0.026263537746968546 | 0.775 |
| 0.06363776494116635 | 0.604 |
| 0.3614114781023089 | 0.983 |
| 0.10654698169521715 | 0.649 |
| 0.3046055927062298 | 0.841 |
| 0.37714630446430863 | 0.967 |
| 0.19521780995663973 | 0.568 |
| 0.3142030752303294 | 0.733 |
| 0.6904143507527548 | 0.992 |
| 0.4312245948340798 | 0.618 |
| 0.32741786585036614 | 0.533 |
| 0.021036309047690938 | 0.928 |
| 0.7695275005051075 | 0.938 |
| 0.2044926532559722 | 0.889 |
| 0.3272818650985957 | 0.435 |
| 0.07610144954342213 | 0.125 |
| 0.20125452907996777 | 0.594 |
| 0.09829716803391197 | 0.864 |
| 0.6439577669796592 | 0.833 |
| 0.3419381972375547 | 0.919 |
| 0.3204107579879497 | 0.934 |
| 0.13269619545255507 | 0.495 |
| 0.011056772750736354 | 0.334 |
| 0.2922119380376711 | 0.844 |
| 0.029741697725769956 | 0.5 |
| 0.27507872453836935 | 0.506 |
| 0.10222668030920201 | 0.346 |
| 0.4539258169353172 | 0.878 |
| 0.33878219672908216 | 0.525 |
| 0.027658842386204197 | 0.62 |
| 0.1884211426648672 | 0.721 |
| 0.0687291508504303 | 0.283 |
| 0.34929297203588994 | 0.821 |
| 0.3784472738105331 | 0.874 |
| 0.13930836554991854 | 0.764 |
| 0.42492016845821323 | 0.674 |
| 0.6590686594511417 | 0.979 |
| 0.45494755490085426 | 0.637 |
| 0.466921496658221 | 0.711 |
| 0.06871464184420106 | 0.468 |
| 0.23117734764365228 | 0.933 |
| 0.0007496150353275555 | 0.469 |
| 0.12585671163910794 | 0.637 |
| 0.11216472036963498 | 0.24 |
| 0.4510013553952249 | 0.887 |
| 0.18840369817286828 | 0.557 |
| 0.31068065988936366 | 0.964 |
| 0.42683784209273856 | 0.526 |
| 0.10398531321549198 | 0.901 |
| 0.7139317058360984 | 0.923 |
| 0.3171830406629472 | 0.763 |
| 0.06990049652614183 | 0.638 |
| 0.281412779905172 | 0.765 |
| 0.07827080019479049 | 0.898 |
| 0.02256702906479846 | 0.731 |
| 0.18324164262762954 | 0.49 |
| 0.0051197356811730765 | 0.841 |
| 0.14706259690219325 | 0.373 |
| 0.31366215965240174 | 0.879 |
| 0.24539018958775183 | 0.918 |
| 0.08135435876212871 | 0.218 |
| 0.3621756923907469 | 0.911 |
| 0.038882277838726886 | 0.785 |
| 0.08306550589083717 | 0.669 |
| 0.4675063622316057 | 0.824 |
| 0.03191412994162812 | 0.845 |
| 0.1927380032053796 | 0.234 |
| 0.06568843806283409 | 0.805 |
| 0.032869564417961517 | 0.088 |
| 0.23842427899693974 | 0.975 |
| 0.5014620083327535 | 0.937 |
| 0.4456013958112689 | 0.887 |
| 0.0612157122865441 | 0.631 |
| 0.17814854719259354 | 0.71 |
| 0.1812799180182868 | 0.578 |
| 0.5034737477640042 | 0.969 |
| 0.3210144550923094 | 0.659 |
| 0.14016198027009474 | 0.415 |
| 0.03408276522963816 | 0.439 |
| 0.16950627702906673 | 0.78 |
| 0.035928644244690555 | 0.893 |
| 0.23742431071196513 | 0.508 |
| 0.16496001732671617 | 0.57 |
| 0.5721313041384674 | 0.956 |
| 0.3526026344689779 | 0.839 |
| 0.6091334268947564 | 0.944 |
| 0.5064901151650142 | 0.958 |
| 0.33075892791553896 | 0.636 |
| 0.5620003076915702 | 0.769 |
| 0.032955751405032485 | 0.738 |
| 0.5553405437692924 | 0.943 |
| 0.0022865250476112875 | 0.638 |
| 0.8614466259363753 | 0.892 |
| 0.35420729860241884 | 0.442 |
| 0.5750028501487563 | 0.867 |
| 0.2603731599512247 | 0.655 |
| 0.14670109454233538 | 0.922 |
| 0.12398342010277352 | 0.667 |
| 0.12137621216892402 | 0.678 |
| 0.20001113490948508 | 0.828 |
| 0.2950366811074925 | 0.575 |
| 0.4754029629443117 | 0.964 |
| 0.4518337134493786 | 0.731 |
| 0.6531915184816697 | 0.972 |
| 0.3693338276798064 | 0.681 |
| 0.26406149582065064 | 0.581 |
| 0.023871845246532297 | 0.556 |
| 0.011875181152614434 | 0.721 |
| 0.05378593782368557 | 0.992 |
| 0.00429035708212433 | 0.684 |
| 0.4731935942372404 | 0.776 |
| 0.027536349759800238 | 0.799 |
| 0.033624179396487985 | 0.559 |
| 0.05020360327085316 | 0.25 |
| 0.5126859318897272 | 0.977 |
| 0.6800175559783949 | 0.978 |
| 0.05058832305448091 | 0.83 |
| 0.3879882320925574 | 0.862 |
| 0.12340038976655965 | 0.826 |
| 0.3167365109302642 | 0.892 |
| 0.21880783228035094 | 0.996 |
| 0.06640814240195592 | 0.371 |
| 0.2121761423044719 | 0.638 |
| 0.4549704865179227 | 0.703 |
| 0.5149337656840902 | 0.914 |
| 0.22234683238022102 | 0.769 |
| 0.41004946374436224 | 0.977 |
| 0.0455354359875253 | 0.352 |
| 0.2703996253123123 | 0.966 |
| 0.43004141543450347 | 0.809 |
| 0.42079823259756566 | 0.985 |
| 0.12066205467118629 | 0.231 |
| 0.19631455302333156 | 0.705 |
| 0.0680734818827452 | 0.811 |
| 0.35137461730979724 | 0.96 |
| 0.22970726889530624 | 0.971 |
| 0.1254560726965338 | 0.641 |
| 0.04612604976808554 | 0.648 |
| 0.4506597248088712 | 0.624 |
| 0.21261283049555024 | 0.559 |
| 0.13115902670080926 | 0.859 |
| 0.7912858528954885 | 0.977 |
| 0.46952318534387016 | 0.87 |
| 0.3515398860895922 | 0.684 |
| 0.27090339510208883 | 0.33 |
| 0.1342937237415811 | 0.759 |
| 0.45952036515222516 | 0.652 |
| 0.15356760725492757 | 0.975 |
| 0.061906382466916376 | 0.999 |
| 0.023531551799763184 | 0.952 |
| 0.10049433108726169 | 0.953 |
| 0.4153725929755834 | 0.805 |
| 0.6761602402521927 | 0.847 |
| 0.093330823915595 | 0.779 |
| 0.3378801503079314 | 0.813 |